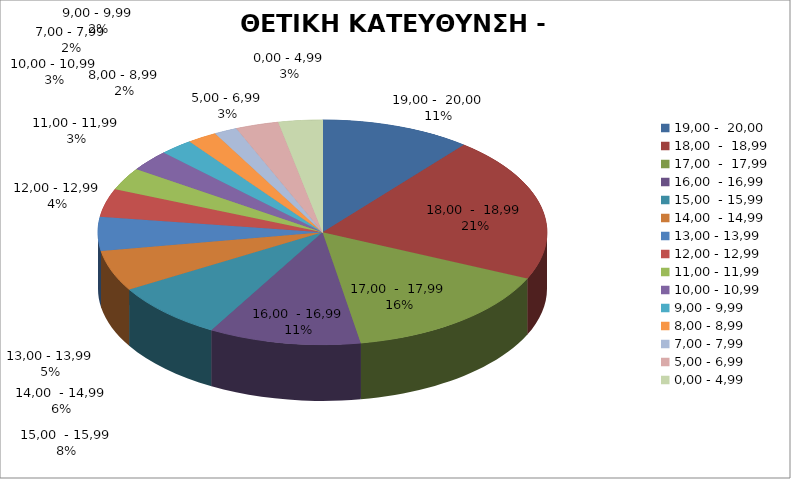
| Category | ΘΕΤΙΚΗ ΚΑΤΕΥΘΥΝΣΗ - 2010 |
|---|---|
| 19,00 -  20,00 | 10.814 |
| 18,00  -  18,99 | 20.926 |
| 17,00  -  17,99 | 15.541 |
| 16,00  - 16,99 | 10.947 |
| 15,00  - 15,99 | 8.246 |
| 14,00  - 14,99 | 5.856 |
| 13,00 - 13,99 | 4.896 |
| 12,00 - 12,99 | 4.034 |
| 11,00 - 11,99 | 3.217 |
| 10,00 - 10,99 | 3.03 |
| 9,00 - 9,99 | 2.417 |
| 8,00 - 8,99 | 2.15 |
| 7,00 - 7,99 | 1.653 |
| 5,00 - 6,99 | 3.11 |
| 0,00 - 4,99 | 3.163 |